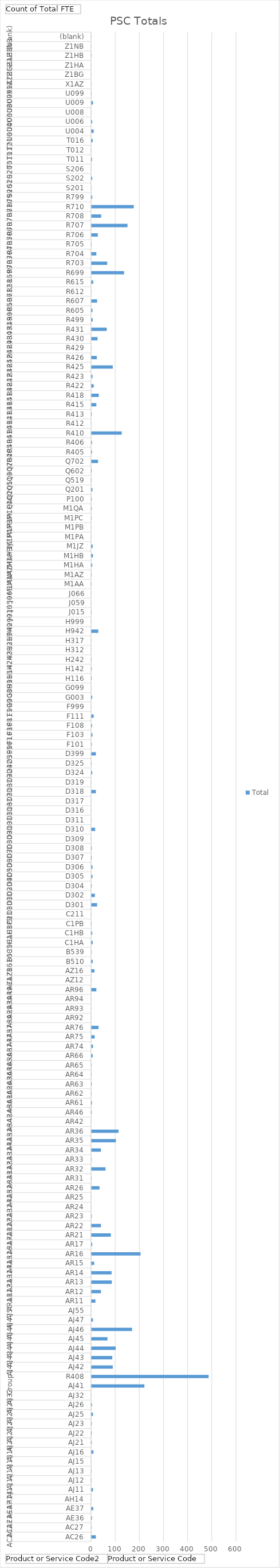
| Category | Total |
|---|---|
| 0 | 20 |
| 1 | 2 |
| 2 | 4 |
| 3 | 9 |
| 4 | 1 |
| 5 | 8 |
| 6 | 2 |
| 7 | 2 |
| 8 | 1 |
| 9 | 10 |
| 10 | 3 |
| 11 | 3 |
| 12 | 3 |
| 13 | 8 |
| 14 | 4 |
| 15 | 1 |
| 16 | 221 |
| 17 | 487 |
| 18 | 90 |
| 19 | 88 |
| 20 | 102 |
| 21 | 68 |
| 22 | 170 |
| 23 | 8 |
| 24 | 1 |
| 25 | 18 |
| 26 | 41 |
| 27 | 86 |
| 28 | 85 |
| 29 | 13 |
| 30 | 205 |
| 31 | 5 |
| 32 | 82 |
| 33 | 41 |
| 34 | 3 |
| 35 | 1 |
| 36 | 1 |
| 37 | 35 |
| 38 | 2 |
| 39 | 60 |
| 40 | 2 |
| 41 | 41 |
| 42 | 103 |
| 43 | 114 |
| 44 | 1 |
| 45 | 3 |
| 46 | 4 |
| 47 | 2 |
| 48 | 3 |
| 49 | 2 |
| 50 | 2 |
| 51 | 7 |
| 52 | 8 |
| 53 | 15 |
| 54 | 31 |
| 55 | 1 |
| 56 | 1 |
| 57 | 1 |
| 58 | 22 |
| 59 | 1 |
| 60 | 14 |
| 61 | 7 |
| 62 | 2 |
| 63 | 7 |
| 64 | 5 |
| 65 | 2 |
| 66 | 1 |
| 67 | 25 |
| 68 | 16 |
| 69 | 3 |
| 70 | 6 |
| 71 | 6 |
| 72 | 3 |
| 73 | 3 |
| 74 | 1 |
| 75 | 17 |
| 76 | 1 |
| 77 | 1 |
| 78 | 1 |
| 79 | 20 |
| 80 | 1 |
| 81 | 5 |
| 82 | 2 |
| 83 | 20 |
| 84 | 3 |
| 85 | 6 |
| 86 | 4 |
| 87 | 11 |
| 88 | 1 |
| 89 | 5 |
| 90 | 1 |
| 91 | 3 |
| 92 | 3 |
| 93 | 2 |
| 94 | 1 |
| 95 | 1 |
| 96 | 30 |
| 97 | 1 |
| 98 | 2 |
| 99 | 1 |
| 100 | 1 |
| 101 | 2 |
| 102 | 2 |
| 103 | 5 |
| 104 | 8 |
| 105 | 7 |
| 106 | 1 |
| 107 | 1 |
| 108 | 2 |
| 109 | 3 |
| 110 | 3 |
| 111 | 6 |
| 112 | 2 |
| 113 | 3 |
| 114 | 29 |
| 115 | 4 |
| 116 | 4 |
| 117 | 127 |
| 118 | 1 |
| 119 | 3 |
| 120 | 22 |
| 121 | 32 |
| 122 | 11 |
| 123 | 6 |
| 124 | 90 |
| 125 | 24 |
| 126 | 1 |
| 127 | 27 |
| 128 | 65 |
| 129 | 7 |
| 130 | 6 |
| 131 | 25 |
| 132 | 1 |
| 133 | 9 |
| 134 | 137 |
| 135 | 67 |
| 136 | 22 |
| 137 | 2 |
| 138 | 28 |
| 139 | 151 |
| 140 | 42 |
| 141 | 177 |
| 142 | 5 |
| 143 | 1 |
| 144 | 5 |
| 145 | 1 |
| 146 | 4 |
| 147 | 1 |
| 148 | 7 |
| 149 | 11 |
| 150 | 5 |
| 151 | 1 |
| 152 | 8 |
| 153 | 2 |
| 154 | 1 |
| 155 | 1 |
| 156 | 1 |
| 157 | 2 |
| 158 | 1 |
| 159 | 1 |